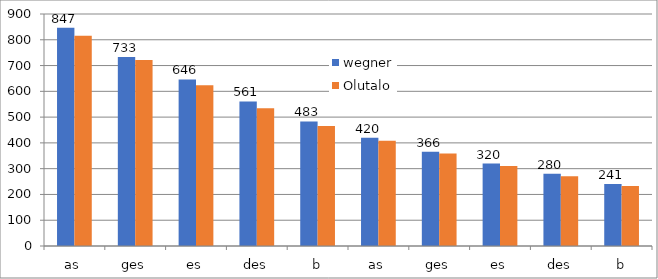
| Category | wegner | Olutalo |
|---|---|---|
| as | 847 | 816 |
| ges | 733 | 722 |
| es | 646 | 624 |
| des | 561 | 534 |
| b | 483 | 466 |
| as | 420 | 408 |
| ges | 366 | 359 |
| es | 320 | 310 |
| des | 280 | 271 |
| b | 241 | 233 |